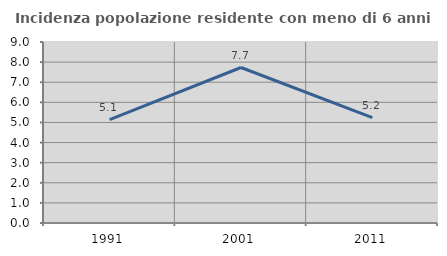
| Category | Incidenza popolazione residente con meno di 6 anni |
|---|---|
| 1991.0 | 5.143 |
| 2001.0 | 7.732 |
| 2011.0 | 5.238 |